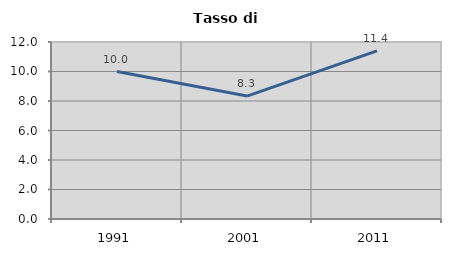
| Category | Tasso di disoccupazione   |
|---|---|
| 1991.0 | 10 |
| 2001.0 | 8.333 |
| 2011.0 | 11.397 |